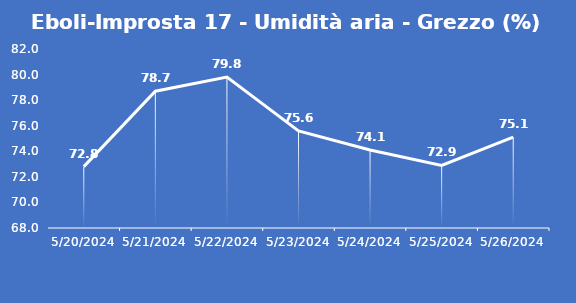
| Category | Eboli-Improsta 17 - Umidità aria - Grezzo (%) |
|---|---|
| 5/20/24 | 72.8 |
| 5/21/24 | 78.7 |
| 5/22/24 | 79.8 |
| 5/23/24 | 75.6 |
| 5/24/24 | 74.1 |
| 5/25/24 | 72.9 |
| 5/26/24 | 75.1 |